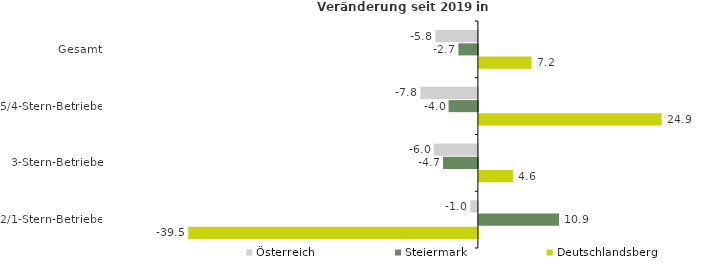
| Category | Österreich | Steiermark | Deutschlandsberg |
|---|---|---|---|
| Gesamt | -5.779 | -2.653 | 7.177 |
| 5/4-Stern-Betriebe | -7.825 | -3.996 | 24.915 |
| 3-Stern-Betriebe | -6.014 | -4.748 | 4.636 |
| 2/1-Stern-Betriebe | -1.021 | 10.926 | -39.477 |